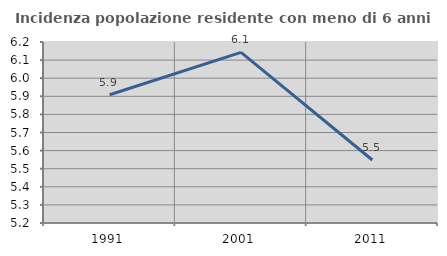
| Category | Incidenza popolazione residente con meno di 6 anni |
|---|---|
| 1991.0 | 5.909 |
| 2001.0 | 6.143 |
| 2011.0 | 5.548 |